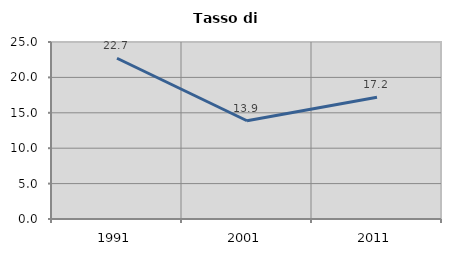
| Category | Tasso di disoccupazione   |
|---|---|
| 1991.0 | 22.705 |
| 2001.0 | 13.875 |
| 2011.0 | 17.198 |